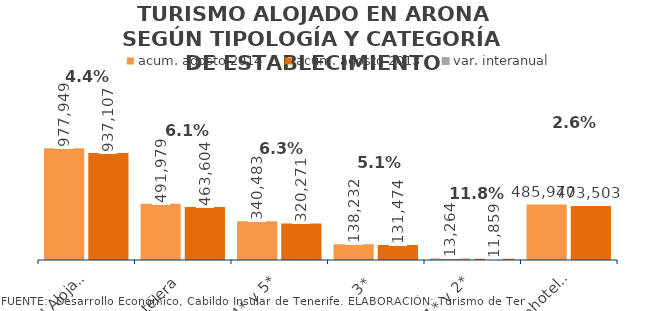
| Category | acum. agosto 2014 | acum. agosto 2013 |
|---|---|---|
| Total Alojados | 977949 | 937107 |
| Hotelera | 491979 | 463604 |
| 4* y 5* | 340483 | 320271 |
| 3* | 138232 | 131474 |
| 1* y 2* | 13264 | 11859 |
| Extrahotelera | 485970 | 473503 |